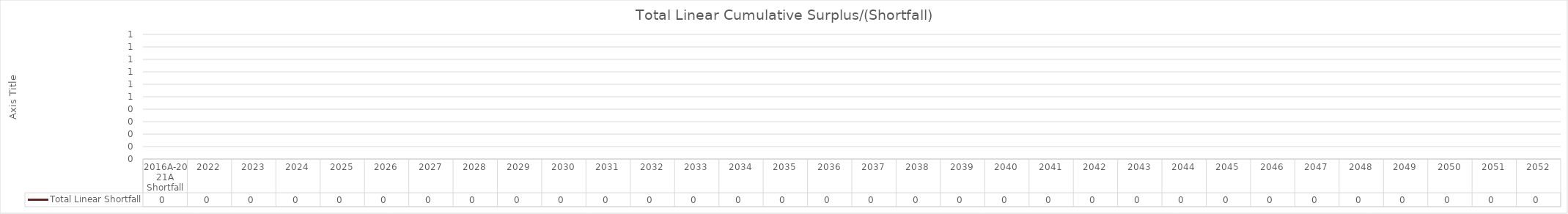
| Category | Total Linear Shortfall |
|---|---|
| 2016A-2021A Shortfall | 0 |
| 2022 | 0 |
| 2023 | 0 |
| 2024 | 0 |
| 2025 | 0 |
| 2026 | 0 |
| 2027 | 0 |
| 2028 | 0 |
| 2029 | 0 |
| 2030 | 0 |
| 2031 | 0 |
| 2032 | 0 |
| 2033 | 0 |
| 2034 | 0 |
| 2035 | 0 |
| 2036 | 0 |
| 2037 | 0 |
| 2038 | 0 |
| 2039 | 0 |
| 2040 | 0 |
| 2041 | 0 |
| 2042 | 0 |
| 2043 | 0 |
| 2044 | 0 |
| 2045 | 0 |
| 2046 | 0 |
| 2047 | 0 |
| 2048 | 0 |
| 2049 | 0 |
| 2050 | 0 |
| 2051 | 0 |
| 2052 | 0 |